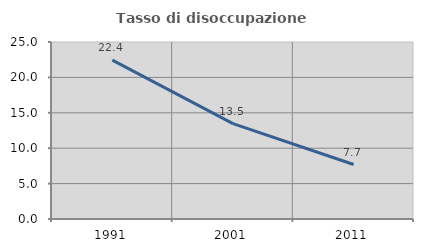
| Category | Tasso di disoccupazione giovanile  |
|---|---|
| 1991.0 | 22.449 |
| 2001.0 | 13.462 |
| 2011.0 | 7.692 |